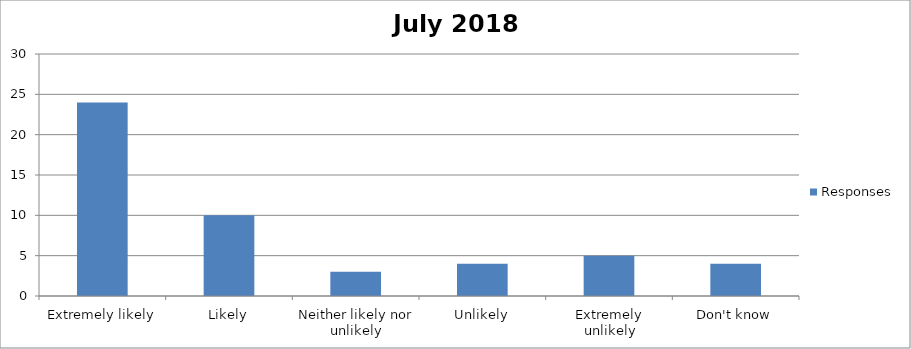
| Category | Responses |
|---|---|
| Extremely likely | 24 |
| Likely | 10 |
| Neither likely nor unlikely | 3 |
| Unlikely | 4 |
| Extremely unlikely | 5 |
| Don't know | 4 |